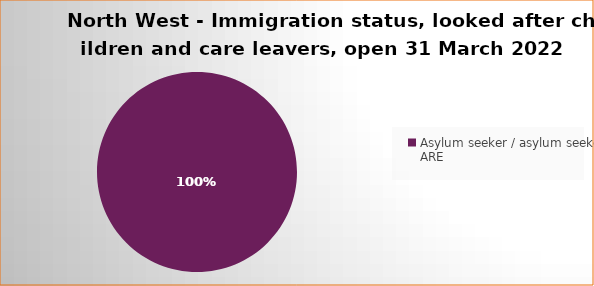
| Category | Number  | Percentage |
|---|---|---|
| Asylum seeker / asylum seeker ARE | 1 | 1 |